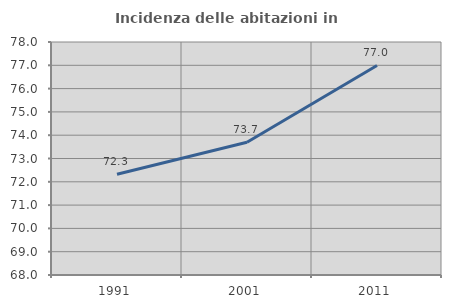
| Category | Incidenza delle abitazioni in proprietà  |
|---|---|
| 1991.0 | 72.326 |
| 2001.0 | 73.698 |
| 2011.0 | 76.993 |